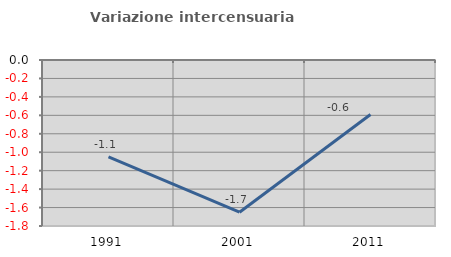
| Category | Variazione intercensuaria annua |
|---|---|
| 1991.0 | -1.052 |
| 2001.0 | -1.65 |
| 2011.0 | -0.592 |